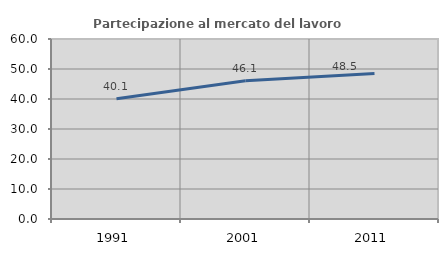
| Category | Partecipazione al mercato del lavoro  femminile |
|---|---|
| 1991.0 | 40.1 |
| 2001.0 | 46.066 |
| 2011.0 | 48.533 |